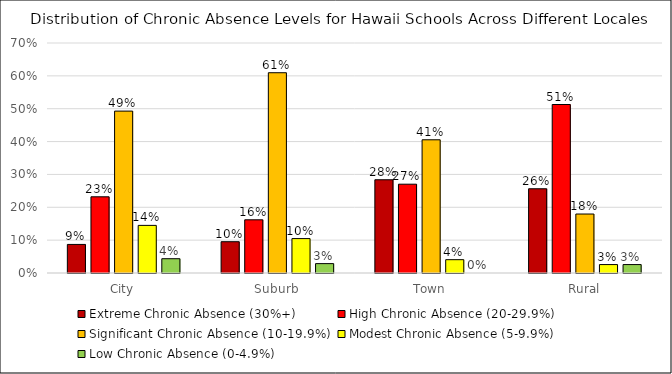
| Category | Extreme Chronic Absence (30%+) | High Chronic Absence (20-29.9%) | Significant Chronic Absence (10-19.9%) | Modest Chronic Absence (5-9.9%) | Low Chronic Absence (0-4.9%) |
|---|---|---|---|---|---|
| City | 0.087 | 0.232 | 0.493 | 0.145 | 0.043 |
| Suburb | 0.095 | 0.162 | 0.61 | 0.105 | 0.029 |
| Town | 0.284 | 0.27 | 0.405 | 0.041 | 0 |
| Rural | 0.256 | 0.513 | 0.179 | 0.026 | 0.026 |